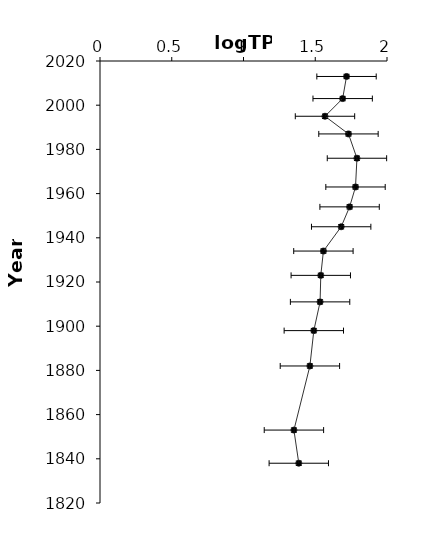
| Category | Series 0 |
|---|---|
| 1.71794 | 2013 |
| 1.69103 | 2003 |
| 1.56788 | 1995 |
| 1.73153 | 1987 |
| 1.79057 | 1976 |
| 1.78058 | 1963 |
| 1.73937 | 1954 |
| 1.68066 | 1945 |
| 1.55687 | 1934 |
| 1.53859 | 1923 |
| 1.53368 | 1911 |
| 1.49003 | 1898 |
| 1.46273 | 1882 |
| 1.35137 | 1853 |
| 1.38529 | 1838 |